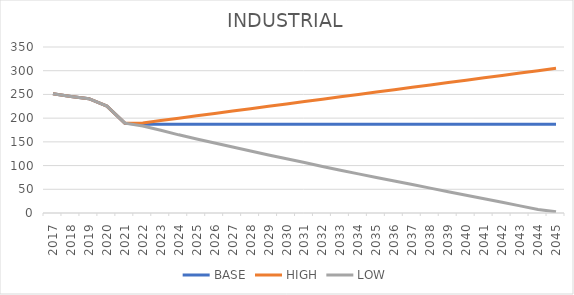
| Category | BASE | HIGH | LOW |
|---|---|---|---|
| 2017.0 | 251.25 | 251.25 | 251.25 |
| 2018.0 | 245.674 | 245.674 | 245.674 |
| 2019.0 | 240.917 | 240.917 | 240.917 |
| 2020.0 | 225.333 | 225.333 | 225.333 |
| 2021.0 | 189.417 | 189.417 | 189.417 |
| 2022.0 | 187.264 | 189.751 | 183.258 |
| 2023.0 | 187.286 | 194.993 | 174.451 |
| 2024.0 | 187.281 | 199.993 | 164.809 |
| 2025.0 | 187.282 | 204.993 | 156.139 |
| 2026.0 | 187.282 | 209.993 | 147.639 |
| 2027.0 | 187.282 | 214.993 | 139.139 |
| 2028.0 | 187.282 | 219.993 | 130.722 |
| 2029.0 | 187.282 | 224.993 | 122.389 |
| 2030.0 | 187.282 | 229.993 | 114.347 |
| 2031.0 | 187.282 | 234.993 | 106.306 |
| 2032.0 | 187.282 | 239.993 | 97.892 |
| 2033.0 | 187.282 | 244.993 | 89.993 |
| 2034.0 | 187.282 | 249.993 | 82.493 |
| 2035.0 | 187.282 | 254.993 | 74.993 |
| 2036.0 | 187.282 | 259.993 | 67.493 |
| 2037.0 | 187.282 | 264.993 | 59.993 |
| 2038.0 | 187.282 | 269.993 | 52.493 |
| 2039.0 | 187.282 | 274.993 | 44.993 |
| 2040.0 | 187.282 | 279.993 | 37.493 |
| 2041.0 | 187.282 | 284.993 | 29.993 |
| 2042.0 | 187.282 | 289.993 | 22.493 |
| 2043.0 | 187.282 | 294.993 | 14.993 |
| 2044.0 | 187.282 | 299.993 | 7.433 |
| 2045.0 | 187.282 | 304.993 | 2.563 |